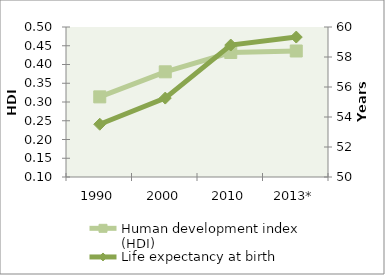
| Category | Human development index (HDI) |
|---|---|
| 1990 | 0.314 |
| 2000 | 0.38 |
| 2010 | 0.432 |
| 2013* | 0.436 |